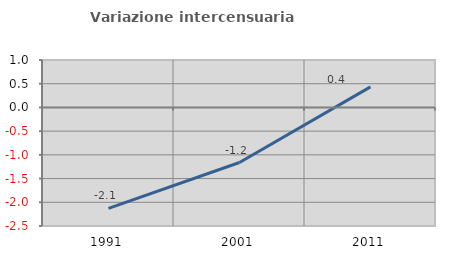
| Category | Variazione intercensuaria annua |
|---|---|
| 1991.0 | -2.129 |
| 2001.0 | -1.161 |
| 2011.0 | 0.434 |